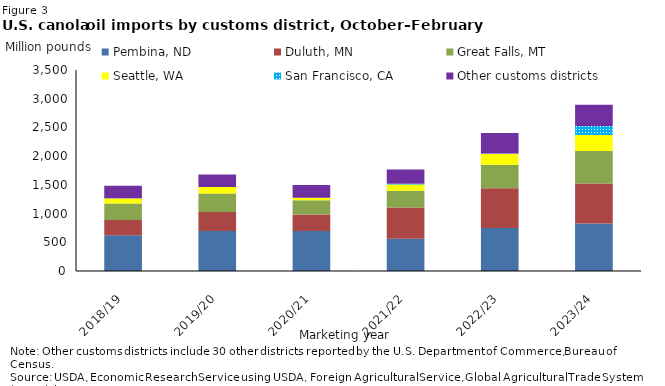
| Category | Pembina, ND | Duluth, MN | Great Falls, MT | Seattle, WA | San Francisco, CA | Other customs districts |
|---|---|---|---|---|---|---|
|  2018/19  | 621.284 | 266.493 | 286.537 | 87.024 | 5.636 | 219.334 |
|  2019/20  | 696.445 | 329.675 | 323.689 | 111.362 | 2.355 | 218.25 |
|  2020/21  | 696.69 | 285.709 | 248.294 | 44.151 | 1.366 | 220.875 |
|  2021/22  | 561.969 | 542.104 | 291.288 | 111.898 | 13.631 | 244.965 |
| 2022/23 | 749.742 | 691.739 | 409.513 | 186.06 | 9.222 | 355.973 |
| 2023/24 | 828.375 | 696.116 | 565.549 | 276.639 | 158.115 | 370.807 |